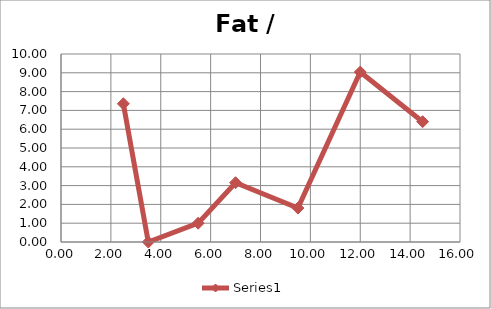
| Category | Series 0 |
|---|---|
| 2.5 | 7.354 |
| 3.5 | 0 |
| 5.5 | 1 |
| 7.0 | 3.153 |
| 9.5 | 1.804 |
| 12.0 | 9.04 |
| 14.5 | 6.4 |